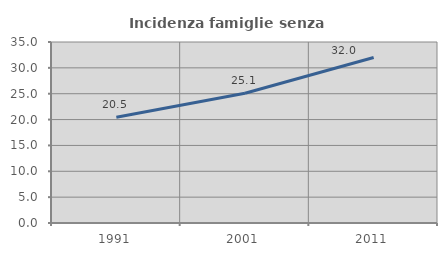
| Category | Incidenza famiglie senza nuclei |
|---|---|
| 1991.0 | 20.453 |
| 2001.0 | 25.097 |
| 2011.0 | 31.993 |